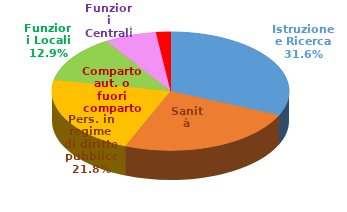
| Category | Series 0 |
|---|---|
| Istruzione e Ricerca | 56996348291 |
| Sanità | 44292247397 |
| Pers. in regime di diritto pubblico | 39334792897 |
| Funzioni Locali | 23221625266 |
| Funzioni Centrali | 12804833282 |
| Comparto aut. o fuori comparto | 3554507912 |